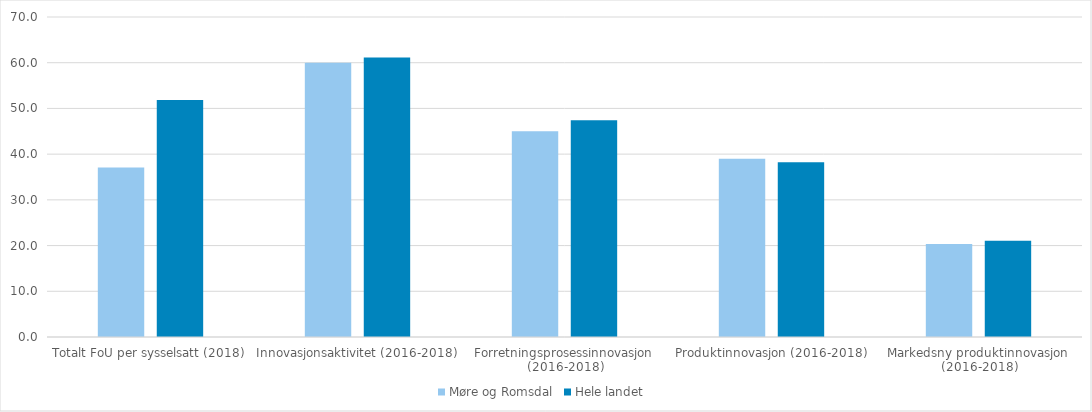
| Category | Møre og Romsdal | Hele landet  |
|---|---|---|
| Totalt FoU per sysselsatt (2018) | 37.067 | 51.82 |
| Innovasjonsaktivitet (2016-2018) | 60 | 61.147 |
| Forretningsprosessinnovasjon (2016-2018) | 45 | 47.427 |
| Produktinnovasjon (2016-2018) | 39 | 38.209 |
| Markedsny produktinnovasjon (2016-2018) | 20.318 | 21.052 |